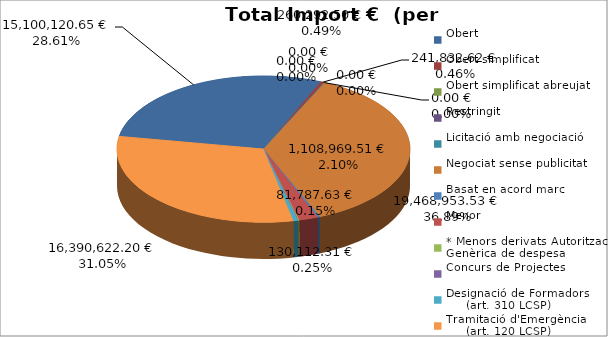
| Category | Total preu
(amb IVA) |
|---|---|
| Obert | 15100120.65 |
| Obert simplificat | 241832.62 |
| Obert simplificat abreujat | 0 |
| Restringit | 0 |
| Licitació amb negociació | 0 |
| Negociat sense publicitat | 19468953.53 |
| Basat en acord marc | 130112.31 |
| Menor | 1108969.51 |
| * Menors derivats Autorització Genèrica de despesa | 81787.63 |
| Concurs de Projectes | 0 |
| Designació de Formadors
     (art. 310 LCSP) | 260292.5 |
| Tramitació d'Emergència
     (art. 120 LCSP) | 16390622.2 |